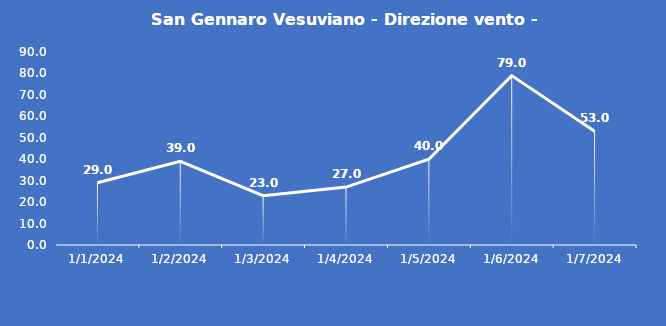
| Category | San Gennaro Vesuviano - Direzione vento - Grezzo (°N) |
|---|---|
| 1/1/24 | 29 |
| 1/2/24 | 39 |
| 1/3/24 | 23 |
| 1/4/24 | 27 |
| 1/5/24 | 40 |
| 1/6/24 | 79 |
| 1/7/24 | 53 |